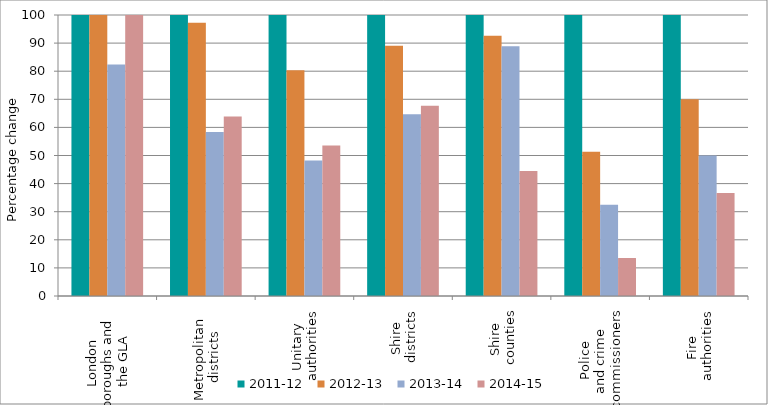
| Category | 2011-12 | 2012-13 | 2013-14 | 2014-15 |
|---|---|---|---|---|
| London 
boroughs and 
the GLA | 100 | 100 | 82.353 | 100 |
| Metropolitan 
districts | 100 | 97.222 | 58.333 | 63.889 |
| Unitary 
authorities | 100 | 80.357 | 48.214 | 53.571 |
| Shire 
districts | 100 | 89.055 | 64.677 | 67.662 |
| Shire 
counties | 100 | 92.593 | 88.889 | 44.444 |
| Police 
and crime 
commissioners | 100 | 51.351 | 32.432 | 13.514 |
| Fire 
authorities | 100 | 70 | 50 | 36.667 |